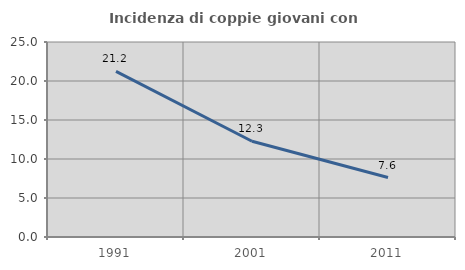
| Category | Incidenza di coppie giovani con figli |
|---|---|
| 1991.0 | 21.24 |
| 2001.0 | 12.281 |
| 2011.0 | 7.626 |